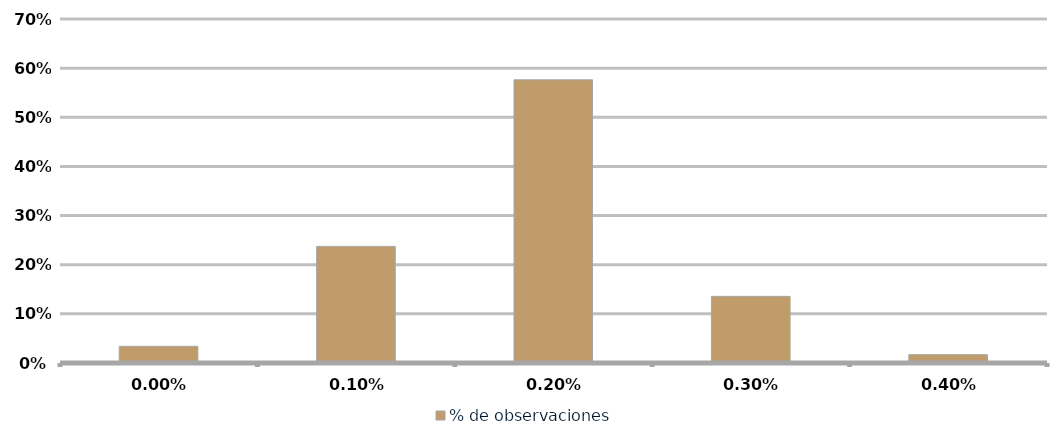
| Category | % de observaciones  |
|---|---|
| 0.0 | 0.034 |
| 0.001 | 0.237 |
| 0.002 | 0.576 |
| 0.003 | 0.136 |
| 0.004 | 0.017 |